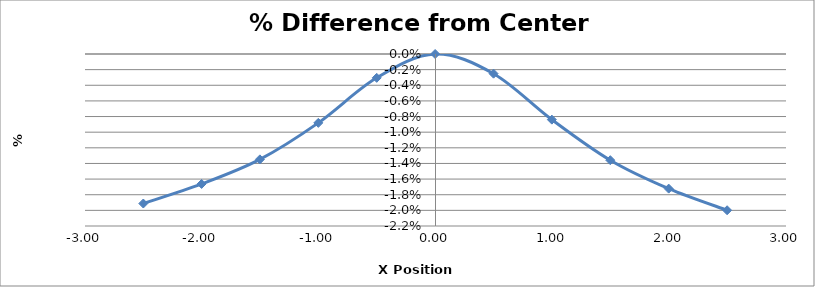
| Category | Series 0 |
|---|---|
| -2.5010000000000003 | -0.019 |
| -2.002 | -0.017 |
| -1.5030000000000001 | -0.013 |
| -1.0030000000000001 | -0.009 |
| -0.5030000000000001 | -0.003 |
| -0.0030000000000001137 | 0 |
| 0.4969999999999999 | -0.003 |
| 0.9959999999999996 | -0.008 |
| 1.4959999999999996 | -0.014 |
| 1.9959999999999996 | -0.017 |
| 2.4959999999999996 | -0.02 |